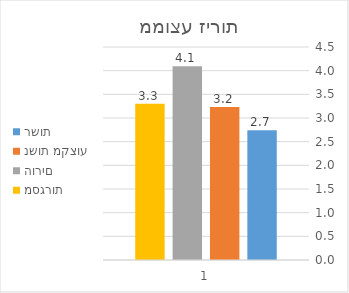
| Category | רשות | נשות מקצוע | הורים | מסגרות |
|---|---|---|---|---|
| 0 | 2.739 | 3.231 | 4.091 | 3.3 |